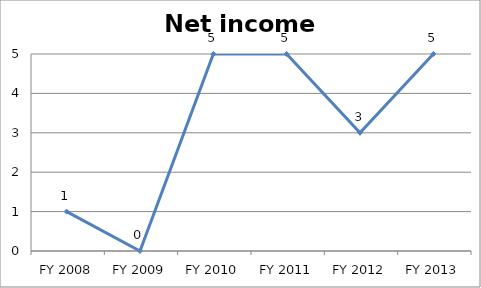
| Category | Net income score |
|---|---|
| FY 2013 | 5 |
| FY 2012 | 3 |
| FY 2011 | 5 |
| FY 2010 | 5 |
| FY 2009 | 0 |
| FY 2008 | 1 |